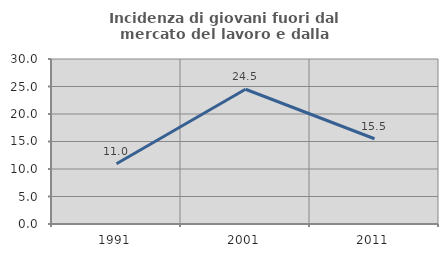
| Category | Incidenza di giovani fuori dal mercato del lavoro e dalla formazione  |
|---|---|
| 1991.0 | 10.965 |
| 2001.0 | 24.503 |
| 2011.0 | 15.504 |